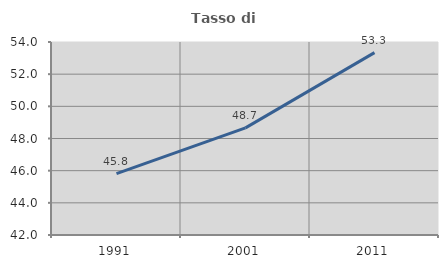
| Category | Tasso di occupazione   |
|---|---|
| 1991.0 | 45.818 |
| 2001.0 | 48.663 |
| 2011.0 | 53.337 |